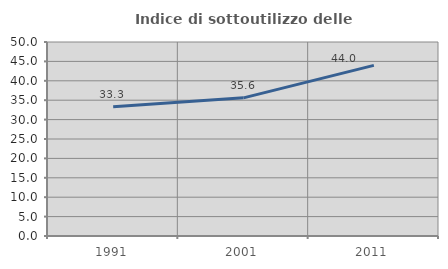
| Category | Indice di sottoutilizzo delle abitazioni  |
|---|---|
| 1991.0 | 33.333 |
| 2001.0 | 35.61 |
| 2011.0 | 43.977 |